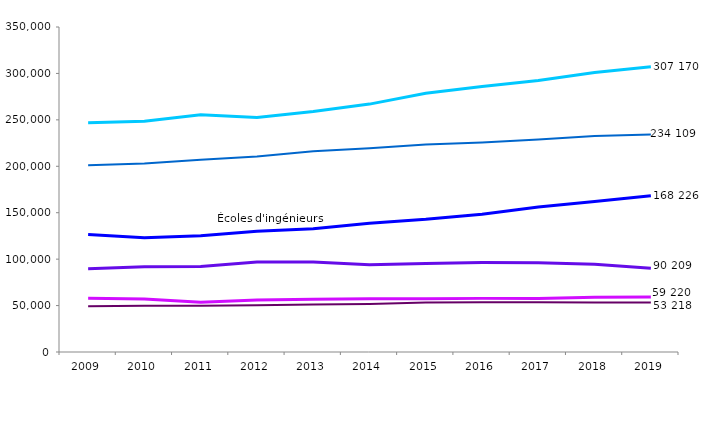
| Category | Université (formations scientifiques + ingénieurs) | Université (santé) | Écoles d'ingénieurs | STS et assimilés scientifique | DUT scientifique | CPGE scientifique |
|---|---|---|---|---|---|---|
| 2009.0 | 246848 | 201073 | 126570 | 89605 | 57858 | 49326 |
| 2010.0 | 248381 | 202912 | 123018 | 91793 | 56982 | 49678 |
| 2011.0 | 255594 | 206947 | 125268 | 92039 | 53572 | 49747 |
| 2012.0 | 252633 | 210424 | 129924 | 96878 | 56033 | 50479 |
| 2013.0 | 258993 | 216224 | 132745 | 96824 | 56710 | 51202 |
| 2014.0 | 266962 | 219328 | 138757 | 94060 | 57302 | 51774 |
| 2015.0 | 278635 | 223528 | 142903 | 95427 | 57310 | 53204 |
| 2016.0 | 285817 | 225662 | 148460 | 96410 | 57750 | 53681 |
| 2017.0 | 292434 | 228800 | 156123 | 96171 | 57678 | 53599 |
| 2018.0 | 301050 | 232512 | 162187 | 94598 | 59005 | 53305 |
| 2019.0 | 307170 | 234109 | 168226 | 90209 | 59220 | 53218 |